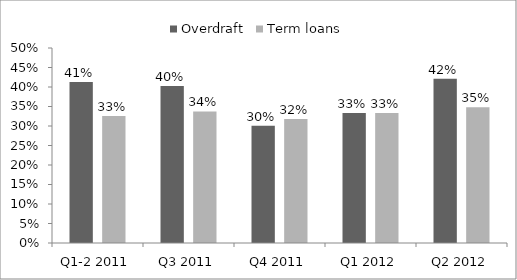
| Category | Overdraft | Term loans |
|---|---|---|
| Q1-2 2011 | 0.413 | 0.326 |
| Q3 2011 | 0.403 | 0.337 |
| Q4 2011 | 0.301 | 0.318 |
| Q1 2012 | 0.333 | 0.333 |
| Q2 2012 | 0.421 | 0.348 |